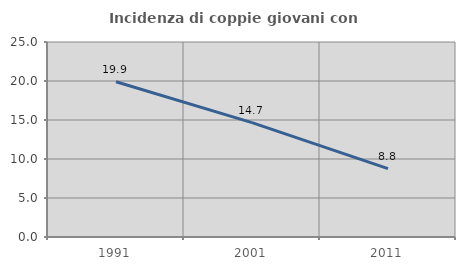
| Category | Incidenza di coppie giovani con figli |
|---|---|
| 1991.0 | 19.896 |
| 2001.0 | 14.661 |
| 2011.0 | 8.765 |